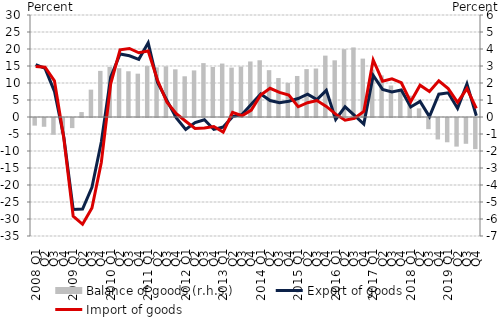
| Category | Balance of goods (r.h.s.) |
|---|---|
| 2008. I. | -0.45 |
|          II. | -0.517 |
|          III. | -0.987 |
|          IV. | -0.919 |
| 2009. I. | -0.594 |
|          II. | 0.29 |
|          III. | 1.61 |
|          IV. | 2.713 |
| 2010. I. | 2.948 |
|          II. | 2.87 |
|          III. | 2.691 |
|          IV. | 2.548 |
| 2011. I. | 3.006 |
|          II. | 2.919 |
|          III. | 2.981 |
|          IV. | 2.803 |
| 2012. I. | 2.395 |
|          II. | 2.741 |
|          III. | 3.17 |
|          IV. | 2.94 |
| 2013. I. | 3.144 |
| II. | 2.906 |
|          III. | 2.969 |
| IV. | 3.266 |
| 2014. I. | 3.337 |
| II. | 2.755 |
|          III. | 2.292 |
| IV. | 2.006 |
| 2015. I. | 2.414 |
| II. | 2.816 |
|          III. | 2.851 |
| IV. | 3.61 |
| 2016. I. | 3.333 |
| II. | 3.991 |
|          III. | 4.093 |
| IV. | 3.434 |
| 2017. I. | 2.793 |
| II. | 2.448 |
|          III. | 1.853 |
| IV. | 1.52 |
| 2018. I. | 1.254 |
| II. | 0.508 |
|          III. | -0.656 |
| IV. | -1.261 |
| 2019. I. | -1.428 |
| II. | -1.682 |
|          III. | -1.518 |
| IV. | -1.83 |